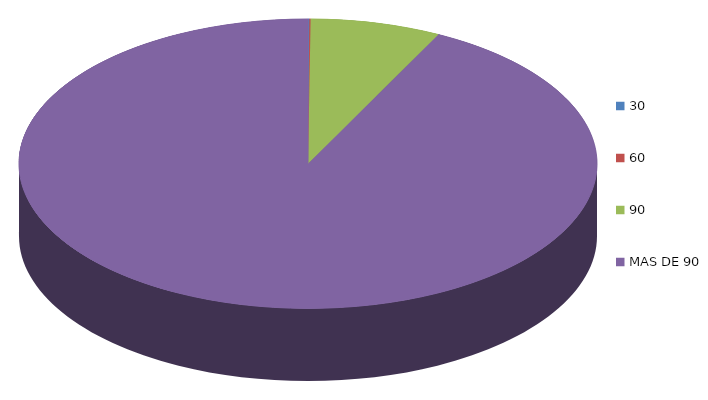
| Category | Series 0 | 41,306.9 |
|---|---|---|
| 0 | 41306.9 |  |
| 1 | 41874.9 |  |
| 2 | 4204604.4 |  |
| 3 | 53234234.9 |  |